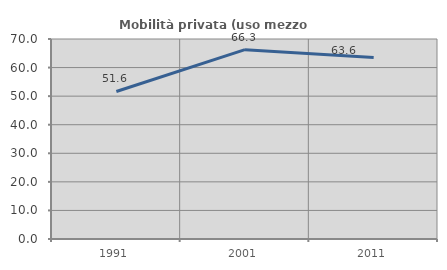
| Category | Mobilità privata (uso mezzo privato) |
|---|---|
| 1991.0 | 51.63 |
| 2001.0 | 66.27 |
| 2011.0 | 63.566 |